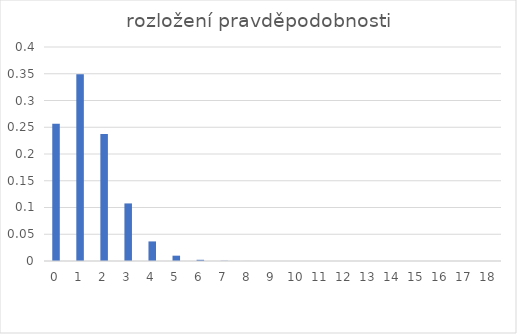
| Category | pravděpodobnost |
|---|---|
| 0.0 | 0.257 |
| 1.0 | 0.349 |
| 2.0 | 0.237 |
| 3.0 | 0.108 |
| 4.0 | 0.037 |
| 5.0 | 0.01 |
| 6.0 | 0.002 |
| 7.0 | 0 |
| 8.0 | 0 |
| 9.0 | 0 |
| 10.0 | 0 |
| 11.0 | 0 |
| 12.0 | 0 |
| 13.0 | 0 |
| 14.0 | 0 |
| 15.0 | 0 |
| 16.0 | 0 |
| 17.0 | 0 |
| 18.0 | 0 |